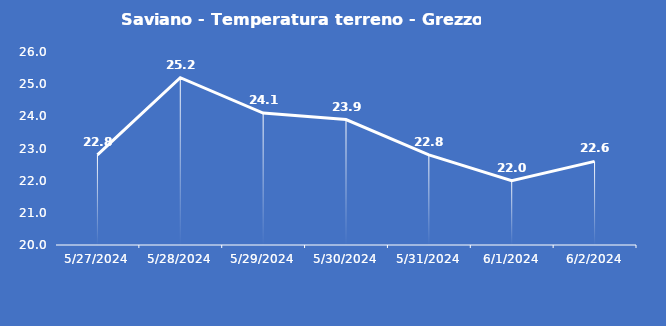
| Category | Saviano - Temperatura terreno - Grezzo (°C) |
|---|---|
| 5/27/24 | 22.8 |
| 5/28/24 | 25.2 |
| 5/29/24 | 24.1 |
| 5/30/24 | 23.9 |
| 5/31/24 | 22.8 |
| 6/1/24 | 22 |
| 6/2/24 | 22.6 |